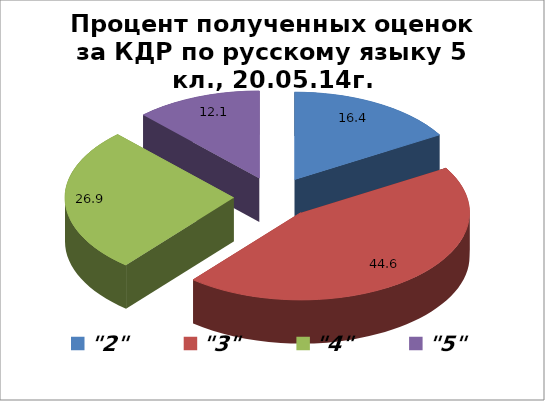
| Category | Series 0 |
|---|---|
| "2" | 16.447 |
| "3" | 44.569 |
| "4" | 26.904 |
| "5" | 12.081 |